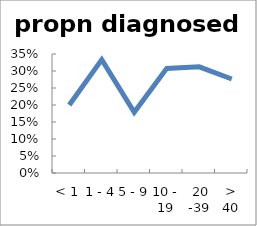
| Category | propn diagnosed |
|---|---|
| < 1 | 0.2 |
| 1 - 4 | 0.333 |
| 5 - 9 | 0.179 |
| 10 - 19 | 0.308 |
|  20 -39 | 0.312 |
| > 40 | 0.276 |